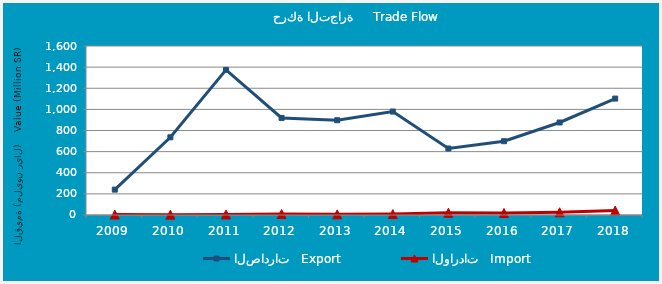
| Category | الصادرات   Export | الواردات   Import |
|---|---|---|
| 2009.0 | 240293699 | 4197109 |
| 2010.0 | 735531187 | 3484302 |
| 2011.0 | 1374276411 | 5350408 |
| 2012.0 | 919034347 | 9414569 |
| 2013.0 | 897228104 | 6308404 |
| 2014.0 | 979516234 | 8935347 |
| 2015.0 | 629584628 | 21552217 |
| 2016.0 | 698585376 | 19303913 |
| 2017.0 | 875983631 | 25580667 |
| 2018.0 | 1102252275 | 42037983 |